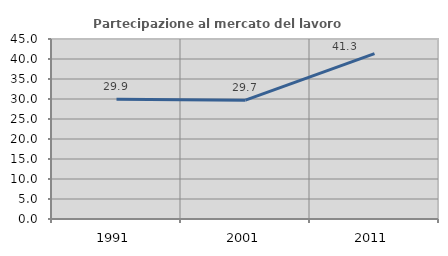
| Category | Partecipazione al mercato del lavoro  femminile |
|---|---|
| 1991.0 | 29.93 |
| 2001.0 | 29.697 |
| 2011.0 | 41.33 |